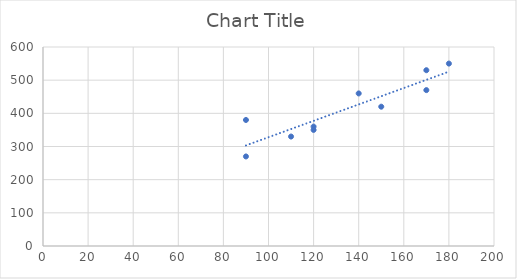
| Category | Series 0 |
|---|---|
| 150.0 | 420 |
| 170.0 | 470 |
| 120.0 | 350 |
| 120.0 | 360 |
| 90.0 | 270 |
| 180.0 | 550 |
| 170.0 | 530 |
| 140.0 | 460 |
| 90.0 | 380 |
| 110.0 | 330 |